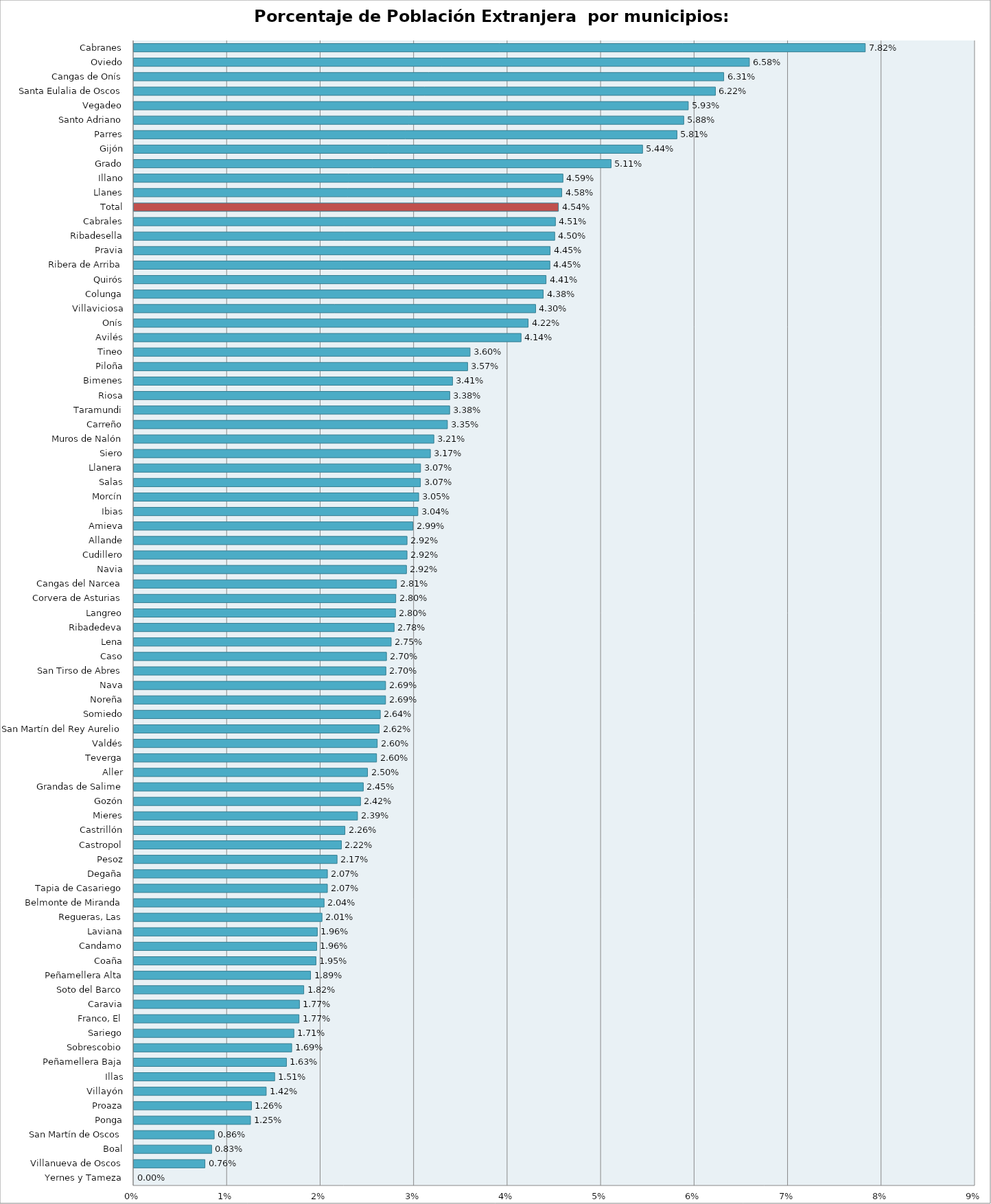
| Category | Series 0 |
|---|---|
| Yernes y Tameza | 0 |
| Villanueva de Oscos | 0.008 |
| Boal | 0.008 |
| San Martín de Oscos | 0.009 |
| Ponga | 0.012 |
| Proaza | 0.013 |
| Villayón | 0.014 |
| Illas | 0.015 |
| Peñamellera Baja | 0.016 |
| Sobrescobio | 0.017 |
| Sariego | 0.017 |
| Franco, El | 0.018 |
| Caravia | 0.018 |
| Soto del Barco | 0.018 |
| Peñamellera Alta | 0.019 |
| Coaña | 0.019 |
| Candamo | 0.02 |
| Laviana | 0.02 |
| Regueras, Las | 0.02 |
| Belmonte de Miranda | 0.02 |
| Tapia de Casariego | 0.021 |
| Degaña | 0.021 |
| Pesoz | 0.022 |
| Castropol | 0.022 |
| Castrillón | 0.023 |
| Mieres | 0.024 |
| Gozón | 0.024 |
| Grandas de Salime | 0.025 |
| Aller | 0.025 |
| Teverga | 0.026 |
| Valdés | 0.026 |
| San Martín del Rey Aurelio | 0.026 |
| Somiedo | 0.026 |
| Noreña | 0.027 |
| Nava | 0.027 |
| San Tirso de Abres | 0.027 |
| Caso | 0.027 |
| Lena | 0.028 |
| Ribadedeva | 0.028 |
| Langreo | 0.028 |
| Corvera de Asturias | 0.028 |
| Cangas del Narcea | 0.028 |
| Navia | 0.029 |
| Cudillero | 0.029 |
| Allande | 0.029 |
| Amieva | 0.03 |
| Ibias | 0.03 |
| Morcín | 0.03 |
| Salas | 0.031 |
| Llanera | 0.031 |
| Siero | 0.032 |
| Muros de Nalón | 0.032 |
| Carreño | 0.034 |
| Taramundi | 0.034 |
| Riosa | 0.034 |
| Bimenes | 0.034 |
| Piloña | 0.036 |
| Tineo | 0.036 |
| Avilés | 0.041 |
| Onís | 0.042 |
| Villaviciosa | 0.043 |
| Colunga | 0.044 |
| Quirós | 0.044 |
| Ribera de Arriba | 0.045 |
| Pravia | 0.045 |
| Ribadesella | 0.045 |
| Cabrales | 0.045 |
| Total | 0.045 |
| Llanes | 0.046 |
| Illano | 0.046 |
| Grado | 0.051 |
| Gijón | 0.054 |
| Parres | 0.058 |
| Santo Adriano | 0.059 |
| Vegadeo | 0.059 |
| Santa Eulalia de Oscos | 0.062 |
| Cangas de Onís | 0.063 |
| Oviedo | 0.066 |
| Cabranes | 0.078 |